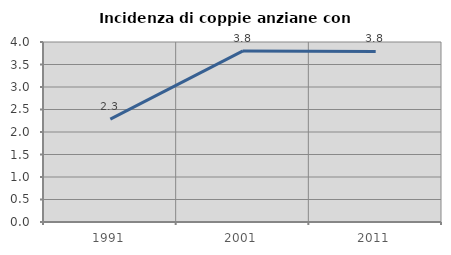
| Category | Incidenza di coppie anziane con figli |
|---|---|
| 1991.0 | 2.286 |
| 2001.0 | 3.802 |
| 2011.0 | 3.79 |